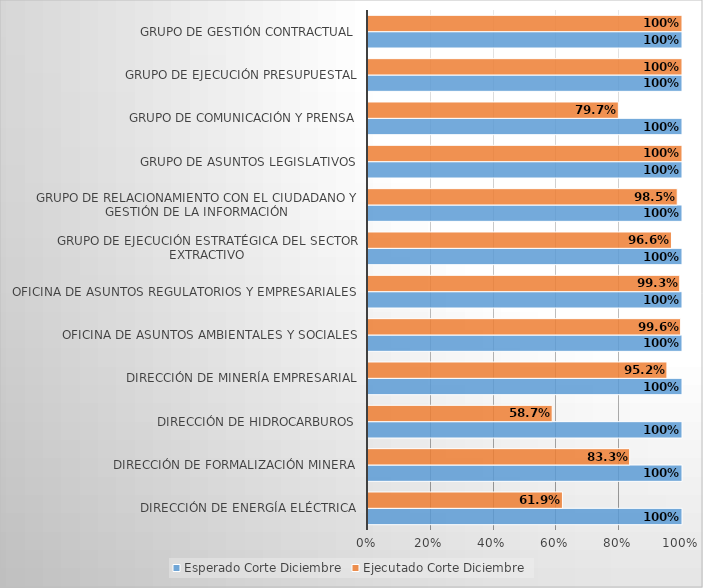
| Category | Esperado Corte Diciembre | Ejecutado Corte Diciembre |
|---|---|---|
| DIRECCIÓN DE ENERGÍA ELÉCTRICA | 1 | 0.619 |
| DIRECCIÓN DE FORMALIZACIÓN MINERA | 1 | 0.833 |
| DIRECCIÓN DE HIDROCARBUROS | 1 | 0.587 |
| DIRECCIÓN DE MINERÍA EMPRESARIAL | 1 | 0.952 |
| OFICINA DE ASUNTOS AMBIENTALES Y SOCIALES | 1 | 0.996 |
| OFICINA DE ASUNTOS REGULATORIOS Y EMPRESARIALES | 1 | 0.993 |
| GRUPO DE EJECUCIÓN ESTRATÉGICA DEL SECTOR EXTRACTIVO | 1 | 0.966 |
| GRUPO DE RELACIONAMIENTO CON EL CIUDADANO Y GESTIÓN DE LA INFORMACIÓN | 1 | 0.985 |
| GRUPO DE ASUNTOS LEGISLATIVOS | 1 | 1 |
| GRUPO DE COMUNICACIÓN Y PRENSA | 1 | 0.797 |
| GRUPO DE EJECUCIÓN PRESUPUESTAL | 1 | 1 |
| GRUPO DE GESTIÓN CONTRACTUAL | 1 | 1 |